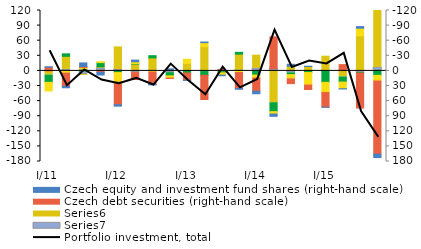
| Category | Series 6 | Series 5 | Foreign equity and investment fund shares  | Foreign debt securities   |
|---|---|---|---|---|
| I/11 | 0.812 | 7.345 | 14.567 | 17.185 |
| II | -2.914 | -26.084 | -4.896 | 4.506 |
| III | 7.125 | 1.717 | -3.713 | -3.275 |
| IV | -5.325 | -2.798 | -8.33 | -1.701 |
| I/12 | -2.798 | -44.867 | 3.306 | 19.066 |
| II | 3.249 | -13.669 | -1.1 | -3.438 |
| III | -0.915 | -24.887 | -4.429 | 2.169 |
| IV | 3.402 | -0.733 | 6.453 | 4.343 |
| I/13 | -0.714 | -14.146 | 4.078 | -8.168 |
| II | 1.279 | -48.104 | 7.436 | -8.051 |
| III | -1.224 | 1.376 | 2.417 | 4.579 |
| IV | -1.402 | -31.82 | -3.652 | 3.278 |
| I/14 | -5.024 | -26.183 | 8.294 | 5.918 |
| II | -4.546 | 63.167 | 17.782 | 4.744 |
| III | 3.872 | -9.272 | 3.481 | 8.634 |
| IV | 0.485 | -8.788 | 2.772 | 24.934 |
| I/15 | -0.202 | -29.014 | 22.663 | 20.346 |
| II | -0.554 | 11.971 | 10.252 | 13.092 |
| III | 3.2 | -69.6 | 1.008 | -15.265 |
| IV | -6.9 | -145.2 | 8.766 | 11.368 |